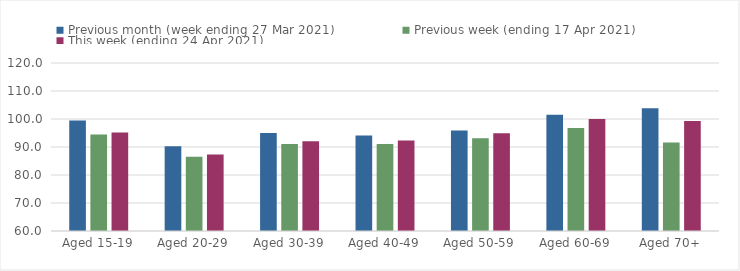
| Category | Previous month (week ending 27 Mar 2021) | Previous week (ending 17 Apr 2021) | This week (ending 24 Apr 2021) |
|---|---|---|---|
| Aged 15-19 | 99.45 | 94.44 | 95.19 |
| Aged 20-29 | 90.24 | 86.49 | 87.35 |
| Aged 30-39 | 94.96 | 91.11 | 92.03 |
| Aged 40-49 | 94.12 | 91.05 | 92.34 |
| Aged 50-59 | 95.86 | 93.14 | 94.87 |
| Aged 60-69 | 101.51 | 96.81 | 100.04 |
| Aged 70+ | 103.86 | 91.58 | 99.27 |